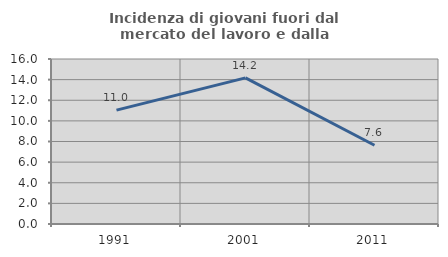
| Category | Incidenza di giovani fuori dal mercato del lavoro e dalla formazione  |
|---|---|
| 1991.0 | 11.043 |
| 2001.0 | 14.167 |
| 2011.0 | 7.639 |